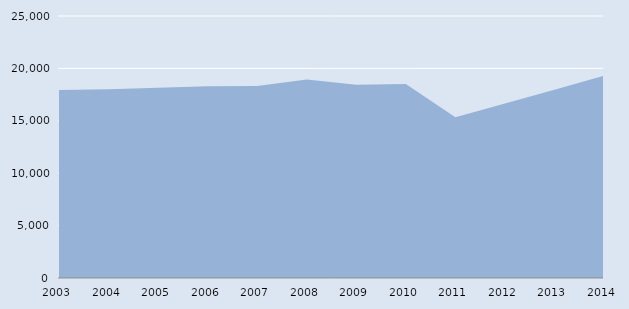
| Category | Series 0 |
|---|---|
| 2003.0 | 17930 |
| 2004.0 | 18000 |
| 2005.0 | 18150 |
| 2006.0 | 18290 |
| 2007.0 | 18310 |
| 2008.0 | 18930 |
| 2009.0 | 18450 |
| 2010.0 | 18520 |
| 2011.0 | 15328 |
| 2012.0 | 16648.667 |
| 2013.0 | 17969.333 |
| 2014.0 | 19290 |